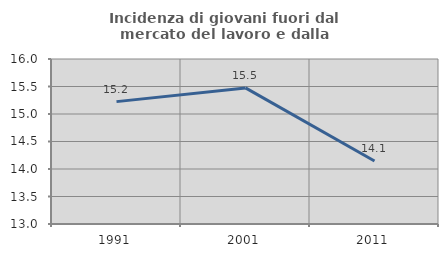
| Category | Incidenza di giovani fuori dal mercato del lavoro e dalla formazione  |
|---|---|
| 1991.0 | 15.225 |
| 2001.0 | 15.475 |
| 2011.0 | 14.146 |